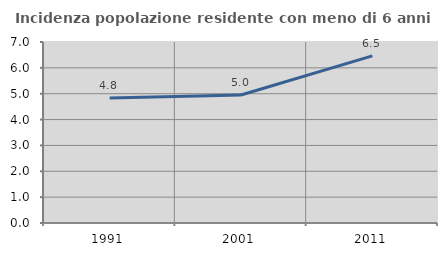
| Category | Incidenza popolazione residente con meno di 6 anni |
|---|---|
| 1991.0 | 4.834 |
| 2001.0 | 4.951 |
| 2011.0 | 6.462 |